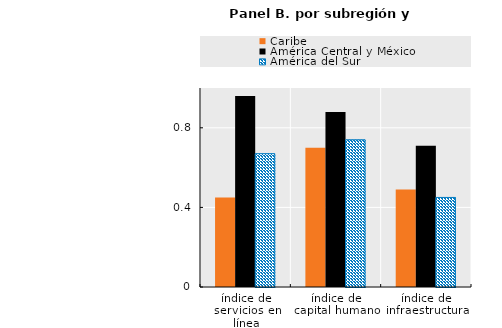
| Category | Caribe | América Central y México | América del Sur |
|---|---|---|---|
| índice de servicios en línea | 0.45 | 0.96 | 0.67 |
| índice de capital humano | 0.7 | 0.88 | 0.74 |
| índice de infraestructura | 0.49 | 0.71 | 0.45 |